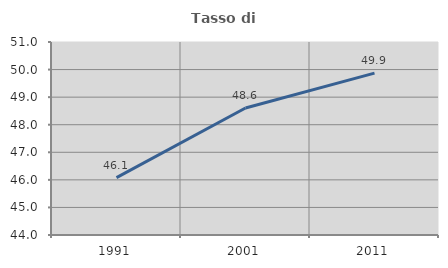
| Category | Tasso di occupazione   |
|---|---|
| 1991.0 | 46.079 |
| 2001.0 | 48.607 |
| 2011.0 | 49.87 |